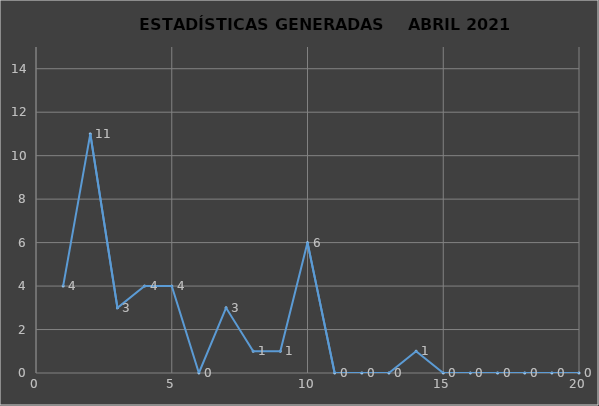
| Category |                   ESTADÍSTICAS GENERADAS     PERÍODO ABRIL 2021 CANTIDAD |
|---|---|
| 0 | 4 |
| 1 | 11 |
| 2 | 3 |
| 3 | 4 |
| 4 | 4 |
| 5 | 0 |
| 6 | 3 |
| 7 | 1 |
| 8 | 1 |
| 9 | 6 |
| 10 | 0 |
| 11 | 0 |
| 12 | 0 |
| 13 | 1 |
| 14 | 0 |
| 15 | 0 |
| 16 | 0 |
| 17 | 0 |
| 18 | 0 |
| 19 | 0 |